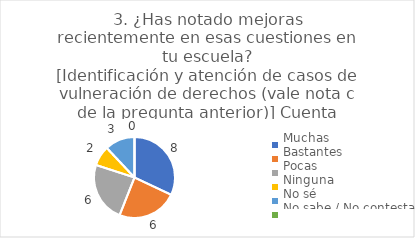
| Category | 3. ¿Has notado mejoras recientemente en esas cuestiones en tu escuela?
[Identificación y atención de casos de vulneración de derechos (vale nota c de la pregunta anterior)] |
|---|---|
| Muchas  | 0.32 |
| Bastantes  | 0.24 |
| Pocas  | 0.24 |
| Ninguna  | 0.08 |
| No sé  | 0.12 |
| No sabe / No contesta | 0 |